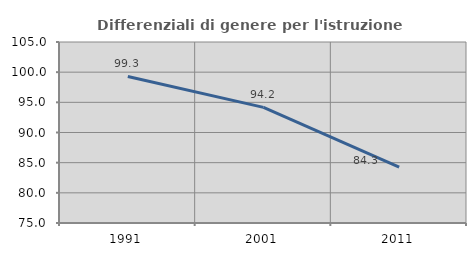
| Category | Differenziali di genere per l'istruzione superiore |
|---|---|
| 1991.0 | 99.29 |
| 2001.0 | 94.167 |
| 2011.0 | 84.255 |